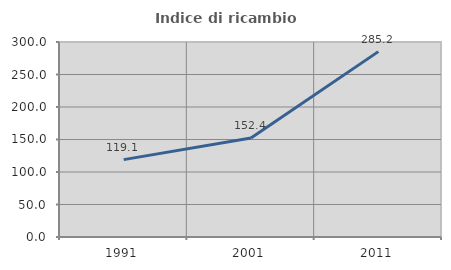
| Category | Indice di ricambio occupazionale  |
|---|---|
| 1991.0 | 119.055 |
| 2001.0 | 152.374 |
| 2011.0 | 285.204 |